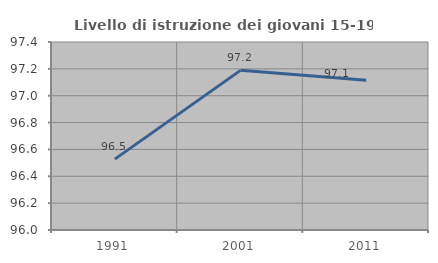
| Category | Livello di istruzione dei giovani 15-19 anni |
|---|---|
| 1991.0 | 96.528 |
| 2001.0 | 97.189 |
| 2011.0 | 97.115 |